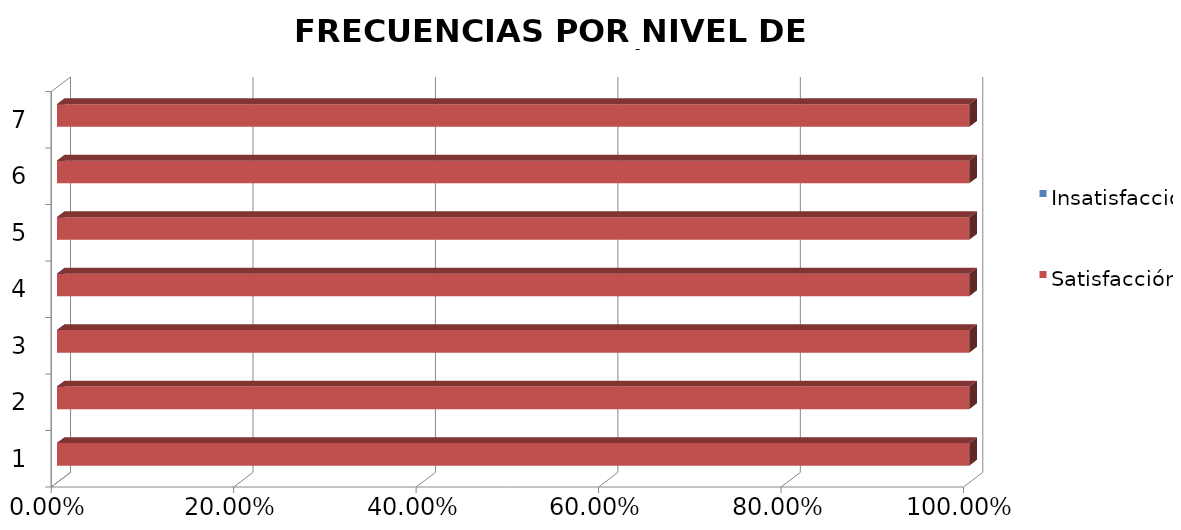
| Category | Insatisfacción | Satisfacción |
|---|---|---|
| 0 | 0 | 1 |
| 1 | 0 | 1 |
| 2 | 0 | 1 |
| 3 | 0 | 1 |
| 4 | 0 | 1 |
| 5 | 0 | 1 |
| 6 | 0 | 1 |